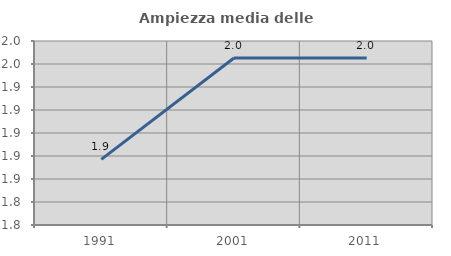
| Category | Ampiezza media delle famiglie |
|---|---|
| 1991.0 | 1.877 |
| 2001.0 | 1.965 |
| 2011.0 | 1.965 |